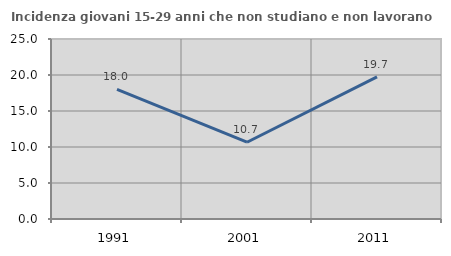
| Category | Incidenza giovani 15-29 anni che non studiano e non lavorano  |
|---|---|
| 1991.0 | 18.007 |
| 2001.0 | 10.664 |
| 2011.0 | 19.741 |